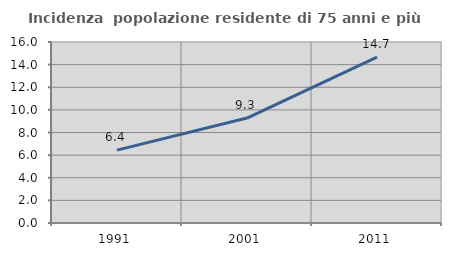
| Category | Incidenza  popolazione residente di 75 anni e più |
|---|---|
| 1991.0 | 6.439 |
| 2001.0 | 9.279 |
| 2011.0 | 14.666 |